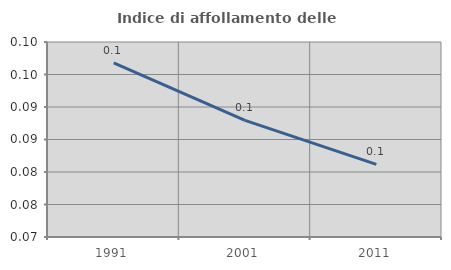
| Category | Indice di affollamento delle abitazioni  |
|---|---|
| 1991.0 | 0.097 |
| 2001.0 | 0.088 |
| 2011.0 | 0.081 |